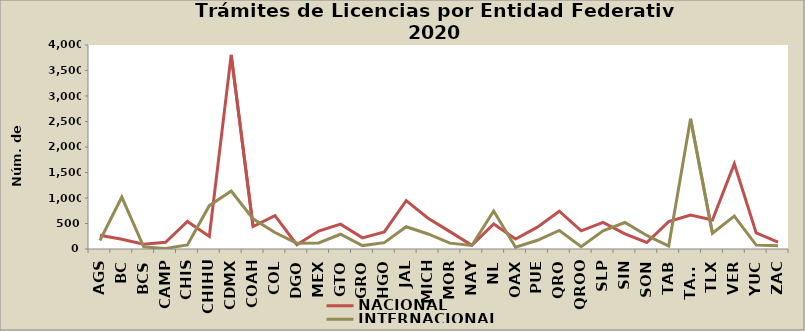
| Category | NACIONAL | INTERNACIONAL |
|---|---|---|
| AGS | 269 | 166 |
| BC | 191 | 1018 |
| BCS | 94 | 41 |
| CAMP | 132 | 12 |
| CHIS | 540 | 79 |
| CHIHU | 246 | 850 |
| CDMX | 3806 | 1137 |
| COAH | 440 | 593 |
| COL | 656 | 323 |
| DGO | 83 | 115 |
| MEX | 351 | 119 |
| GTO | 488 | 289 |
| GRO | 219 | 67 |
| HGO | 334 | 124 |
| JAL | 947 | 436 |
| MICH | 604 | 295 |
| MOR | 341 | 115 |
| NAY | 71 | 69 |
| NL | 492 | 744 |
| OAX | 196 | 34 |
| PUE | 428 | 171 |
| QRO | 741 | 364 |
| QROO | 357 | 47 |
| SLP | 522 | 356 |
| SIN | 298 | 519 |
| SON | 128 | 266 |
| TAB | 538 | 59 |
| TAMS | 667 | 2554 |
| TLX | 568 | 309 |
| VER | 1673 | 646 |
| YUC | 317 | 77 |
| ZAC | 137 | 63 |